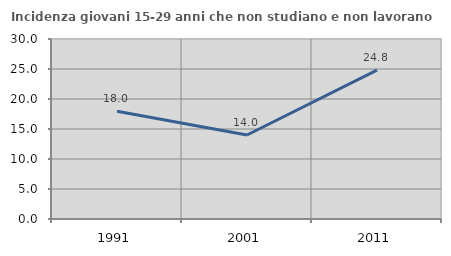
| Category | Incidenza giovani 15-29 anni che non studiano e non lavorano  |
|---|---|
| 1991.0 | 17.969 |
| 2001.0 | 14 |
| 2011.0 | 24.812 |